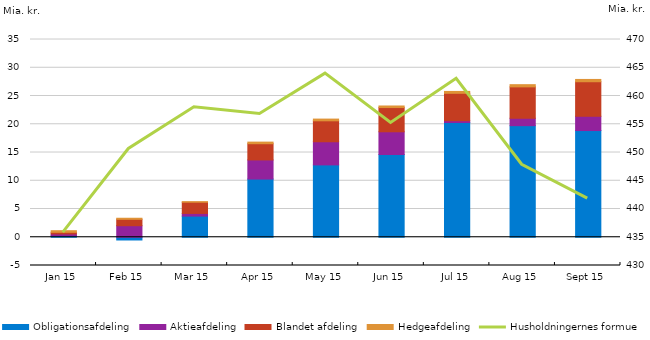
| Category | Obligationsafdeling | Aktieafdeling | Blandet afdeling | Hedgeafdeling |
|---|---|---|---|---|
| 2015-01-01 | 290251104 | 290251105 | 290251106 | 290251107 |
| 2015-02-01 | -484642303 | 2042260750 | 1131382350 | 190395298 |
| 2015-03-01 | 3743484108 | 472563235 | 1983387802 | 95773680 |
| 2015-04-01 | 10297364364 | 3386307580 | 2871133365 | 283844202 |
| 2015-05-01 | 12805012353 | 4095547995 | 3706827863 | 307122826 |
| 2015-06-01 | 14646930449 | 4020873063 | 4286016882 | 278752496 |
| 2015-07-01 | 20307889718 | 314944127 | 4853307564 | 333741177 |
| 2015-08-01 | 19750109452 | 1310273996 | 5555891336 | 389888600 |
| 2015-09-01 | 18887477862 | 2523962359 | 6112621422 | 407432624 |